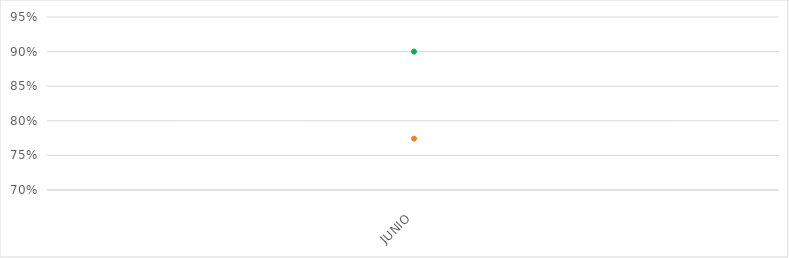
| Category | VALOR  | META PONDERADA |
|---|---|---|
| JUNIO | 0.774 | 0.9 |